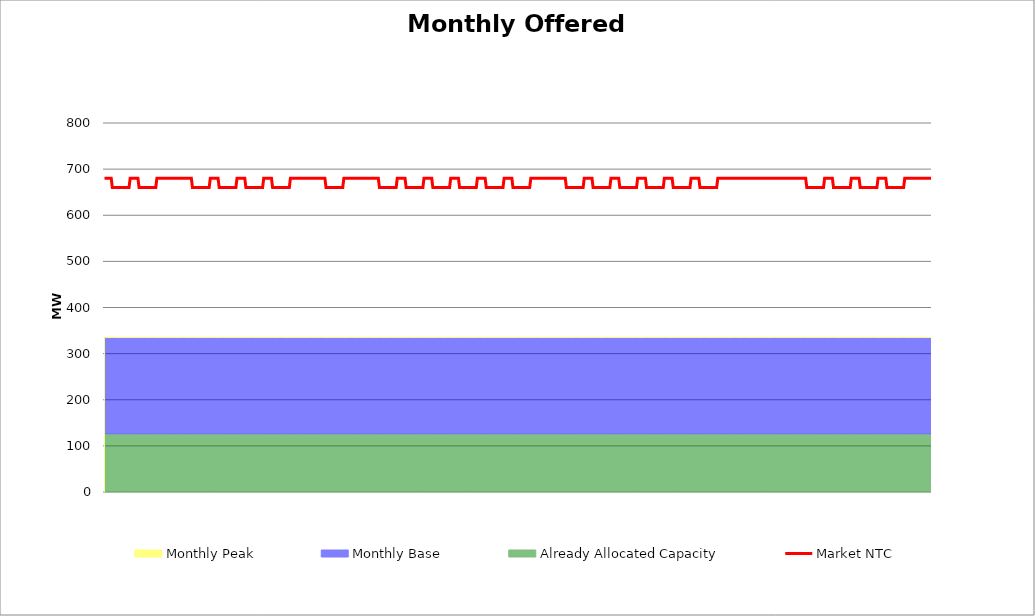
| Category | Market NTC |
|---|---|
| 0 | 680 |
| 1 | 680 |
| 2 | 680 |
| 3 | 680 |
| 4 | 680 |
| 5 | 680 |
| 6 | 680 |
| 7 | 660 |
| 8 | 660 |
| 9 | 660 |
| 10 | 660 |
| 11 | 660 |
| 12 | 660 |
| 13 | 660 |
| 14 | 660 |
| 15 | 660 |
| 16 | 660 |
| 17 | 660 |
| 18 | 660 |
| 19 | 660 |
| 20 | 660 |
| 21 | 660 |
| 22 | 660 |
| 23 | 680 |
| 24 | 680 |
| 25 | 680 |
| 26 | 680 |
| 27 | 680 |
| 28 | 680 |
| 29 | 680 |
| 30 | 680 |
| 31 | 660 |
| 32 | 660 |
| 33 | 660 |
| 34 | 660 |
| 35 | 660 |
| 36 | 660 |
| 37 | 660 |
| 38 | 660 |
| 39 | 660 |
| 40 | 660 |
| 41 | 660 |
| 42 | 660 |
| 43 | 660 |
| 44 | 660 |
| 45 | 660 |
| 46 | 660 |
| 47 | 680 |
| 48 | 680 |
| 49 | 680 |
| 50 | 680 |
| 51 | 680 |
| 52 | 680 |
| 53 | 680 |
| 54 | 680 |
| 55 | 680 |
| 56 | 680 |
| 57 | 680 |
| 58 | 680 |
| 59 | 680 |
| 60 | 680 |
| 61 | 680 |
| 62 | 680 |
| 63 | 680 |
| 64 | 680 |
| 65 | 680 |
| 66 | 680 |
| 67 | 680 |
| 68 | 680 |
| 69 | 680 |
| 70 | 680 |
| 71 | 680 |
| 72 | 680 |
| 73 | 680 |
| 74 | 680 |
| 75 | 680 |
| 76 | 680 |
| 77 | 680 |
| 78 | 680 |
| 79 | 660 |
| 80 | 660 |
| 81 | 660 |
| 82 | 660 |
| 83 | 660 |
| 84 | 660 |
| 85 | 660 |
| 86 | 660 |
| 87 | 660 |
| 88 | 660 |
| 89 | 660 |
| 90 | 660 |
| 91 | 660 |
| 92 | 660 |
| 93 | 660 |
| 94 | 660 |
| 95 | 680 |
| 96 | 680 |
| 97 | 680 |
| 98 | 680 |
| 99 | 680 |
| 100 | 680 |
| 101 | 680 |
| 102 | 680 |
| 103 | 660 |
| 104 | 660 |
| 105 | 660 |
| 106 | 660 |
| 107 | 660 |
| 108 | 660 |
| 109 | 660 |
| 110 | 660 |
| 111 | 660 |
| 112 | 660 |
| 113 | 660 |
| 114 | 660 |
| 115 | 660 |
| 116 | 660 |
| 117 | 660 |
| 118 | 660 |
| 119 | 680 |
| 120 | 680 |
| 121 | 680 |
| 122 | 680 |
| 123 | 680 |
| 124 | 680 |
| 125 | 680 |
| 126 | 680 |
| 127 | 660 |
| 128 | 660 |
| 129 | 660 |
| 130 | 660 |
| 131 | 660 |
| 132 | 660 |
| 133 | 660 |
| 134 | 660 |
| 135 | 660 |
| 136 | 660 |
| 137 | 660 |
| 138 | 660 |
| 139 | 660 |
| 140 | 660 |
| 141 | 660 |
| 142 | 660 |
| 143 | 680 |
| 144 | 680 |
| 145 | 680 |
| 146 | 680 |
| 147 | 680 |
| 148 | 680 |
| 149 | 680 |
| 150 | 680 |
| 151 | 660 |
| 152 | 660 |
| 153 | 660 |
| 154 | 660 |
| 155 | 660 |
| 156 | 660 |
| 157 | 660 |
| 158 | 660 |
| 159 | 660 |
| 160 | 660 |
| 161 | 660 |
| 162 | 660 |
| 163 | 660 |
| 164 | 660 |
| 165 | 660 |
| 166 | 660 |
| 167 | 680 |
| 168 | 680 |
| 169 | 680 |
| 170 | 680 |
| 171 | 680 |
| 172 | 680 |
| 173 | 680 |
| 174 | 680 |
| 175 | 680 |
| 176 | 680 |
| 177 | 680 |
| 178 | 680 |
| 179 | 680 |
| 180 | 680 |
| 181 | 680 |
| 182 | 680 |
| 183 | 680 |
| 184 | 680 |
| 185 | 680 |
| 186 | 680 |
| 187 | 680 |
| 188 | 680 |
| 189 | 680 |
| 190 | 680 |
| 191 | 680 |
| 192 | 680 |
| 193 | 680 |
| 194 | 680 |
| 195 | 680 |
| 196 | 680 |
| 197 | 680 |
| 198 | 680 |
| 199 | 660 |
| 200 | 660 |
| 201 | 660 |
| 202 | 660 |
| 203 | 660 |
| 204 | 660 |
| 205 | 660 |
| 206 | 660 |
| 207 | 660 |
| 208 | 660 |
| 209 | 660 |
| 210 | 660 |
| 211 | 660 |
| 212 | 660 |
| 213 | 660 |
| 214 | 660 |
| 215 | 680 |
| 216 | 680 |
| 217 | 680 |
| 218 | 680 |
| 219 | 680 |
| 220 | 680 |
| 221 | 680 |
| 222 | 680 |
| 223 | 680 |
| 224 | 680 |
| 225 | 680 |
| 226 | 680 |
| 227 | 680 |
| 228 | 680 |
| 229 | 680 |
| 230 | 680 |
| 231 | 680 |
| 232 | 680 |
| 233 | 680 |
| 234 | 680 |
| 235 | 680 |
| 236 | 680 |
| 237 | 680 |
| 238 | 680 |
| 239 | 680 |
| 240 | 680 |
| 241 | 680 |
| 242 | 680 |
| 243 | 680 |
| 244 | 680 |
| 245 | 680 |
| 246 | 680 |
| 247 | 660 |
| 248 | 660 |
| 249 | 660 |
| 250 | 660 |
| 251 | 660 |
| 252 | 660 |
| 253 | 660 |
| 254 | 660 |
| 255 | 660 |
| 256 | 660 |
| 257 | 660 |
| 258 | 660 |
| 259 | 660 |
| 260 | 660 |
| 261 | 660 |
| 262 | 660 |
| 263 | 680 |
| 264 | 680 |
| 265 | 680 |
| 266 | 680 |
| 267 | 680 |
| 268 | 680 |
| 269 | 680 |
| 270 | 680 |
| 271 | 660 |
| 272 | 660 |
| 273 | 660 |
| 274 | 660 |
| 275 | 660 |
| 276 | 660 |
| 277 | 660 |
| 278 | 660 |
| 279 | 660 |
| 280 | 660 |
| 281 | 660 |
| 282 | 660 |
| 283 | 660 |
| 284 | 660 |
| 285 | 660 |
| 286 | 660 |
| 287 | 680 |
| 288 | 680 |
| 289 | 680 |
| 290 | 680 |
| 291 | 680 |
| 292 | 680 |
| 293 | 680 |
| 294 | 680 |
| 295 | 660 |
| 296 | 660 |
| 297 | 660 |
| 298 | 660 |
| 299 | 660 |
| 300 | 660 |
| 301 | 660 |
| 302 | 660 |
| 303 | 660 |
| 304 | 660 |
| 305 | 660 |
| 306 | 660 |
| 307 | 660 |
| 308 | 660 |
| 309 | 660 |
| 310 | 660 |
| 311 | 680 |
| 312 | 680 |
| 313 | 680 |
| 314 | 680 |
| 315 | 680 |
| 316 | 680 |
| 317 | 680 |
| 318 | 680 |
| 319 | 660 |
| 320 | 660 |
| 321 | 660 |
| 322 | 660 |
| 323 | 660 |
| 324 | 660 |
| 325 | 660 |
| 326 | 660 |
| 327 | 660 |
| 328 | 660 |
| 329 | 660 |
| 330 | 660 |
| 331 | 660 |
| 332 | 660 |
| 333 | 660 |
| 334 | 660 |
| 335 | 680 |
| 336 | 680 |
| 337 | 680 |
| 338 | 680 |
| 339 | 680 |
| 340 | 680 |
| 341 | 680 |
| 342 | 680 |
| 343 | 660 |
| 344 | 660 |
| 345 | 660 |
| 346 | 660 |
| 347 | 660 |
| 348 | 660 |
| 349 | 660 |
| 350 | 660 |
| 351 | 660 |
| 352 | 660 |
| 353 | 660 |
| 354 | 660 |
| 355 | 660 |
| 356 | 660 |
| 357 | 660 |
| 358 | 660 |
| 359 | 680 |
| 360 | 680 |
| 361 | 680 |
| 362 | 680 |
| 363 | 680 |
| 364 | 680 |
| 365 | 680 |
| 366 | 680 |
| 367 | 660 |
| 368 | 660 |
| 369 | 660 |
| 370 | 660 |
| 371 | 660 |
| 372 | 660 |
| 373 | 660 |
| 374 | 660 |
| 375 | 660 |
| 376 | 660 |
| 377 | 660 |
| 378 | 660 |
| 379 | 660 |
| 380 | 660 |
| 381 | 660 |
| 382 | 660 |
| 383 | 680 |
| 384 | 680 |
| 385 | 680 |
| 386 | 680 |
| 387 | 680 |
| 388 | 680 |
| 389 | 680 |
| 390 | 680 |
| 391 | 680 |
| 392 | 680 |
| 393 | 680 |
| 394 | 680 |
| 395 | 680 |
| 396 | 680 |
| 397 | 680 |
| 398 | 680 |
| 399 | 680 |
| 400 | 680 |
| 401 | 680 |
| 402 | 680 |
| 403 | 680 |
| 404 | 680 |
| 405 | 680 |
| 406 | 680 |
| 407 | 680 |
| 408 | 680 |
| 409 | 680 |
| 410 | 680 |
| 411 | 680 |
| 412 | 680 |
| 413 | 680 |
| 414 | 680 |
| 415 | 660 |
| 416 | 660 |
| 417 | 660 |
| 418 | 660 |
| 419 | 660 |
| 420 | 660 |
| 421 | 660 |
| 422 | 660 |
| 423 | 660 |
| 424 | 660 |
| 425 | 660 |
| 426 | 660 |
| 427 | 660 |
| 428 | 660 |
| 429 | 660 |
| 430 | 660 |
| 431 | 680 |
| 432 | 680 |
| 433 | 680 |
| 434 | 680 |
| 435 | 680 |
| 436 | 680 |
| 437 | 680 |
| 438 | 680 |
| 439 | 660 |
| 440 | 660 |
| 441 | 660 |
| 442 | 660 |
| 443 | 660 |
| 444 | 660 |
| 445 | 660 |
| 446 | 660 |
| 447 | 660 |
| 448 | 660 |
| 449 | 660 |
| 450 | 660 |
| 451 | 660 |
| 452 | 660 |
| 453 | 660 |
| 454 | 660 |
| 455 | 680 |
| 456 | 680 |
| 457 | 680 |
| 458 | 680 |
| 459 | 680 |
| 460 | 680 |
| 461 | 680 |
| 462 | 680 |
| 463 | 660 |
| 464 | 660 |
| 465 | 660 |
| 466 | 660 |
| 467 | 660 |
| 468 | 660 |
| 469 | 660 |
| 470 | 660 |
| 471 | 660 |
| 472 | 660 |
| 473 | 660 |
| 474 | 660 |
| 475 | 660 |
| 476 | 660 |
| 477 | 660 |
| 478 | 660 |
| 479 | 680 |
| 480 | 680 |
| 481 | 680 |
| 482 | 680 |
| 483 | 680 |
| 484 | 680 |
| 485 | 680 |
| 486 | 680 |
| 487 | 660 |
| 488 | 660 |
| 489 | 660 |
| 490 | 660 |
| 491 | 660 |
| 492 | 660 |
| 493 | 660 |
| 494 | 660 |
| 495 | 660 |
| 496 | 660 |
| 497 | 660 |
| 498 | 660 |
| 499 | 660 |
| 500 | 660 |
| 501 | 660 |
| 502 | 660 |
| 503 | 680 |
| 504 | 680 |
| 505 | 680 |
| 506 | 680 |
| 507 | 680 |
| 508 | 680 |
| 509 | 680 |
| 510 | 680 |
| 511 | 660 |
| 512 | 660 |
| 513 | 660 |
| 514 | 660 |
| 515 | 660 |
| 516 | 660 |
| 517 | 660 |
| 518 | 660 |
| 519 | 660 |
| 520 | 660 |
| 521 | 660 |
| 522 | 660 |
| 523 | 660 |
| 524 | 660 |
| 525 | 660 |
| 526 | 660 |
| 527 | 680 |
| 528 | 680 |
| 529 | 680 |
| 530 | 680 |
| 531 | 680 |
| 532 | 680 |
| 533 | 680 |
| 534 | 680 |
| 535 | 660 |
| 536 | 660 |
| 537 | 660 |
| 538 | 660 |
| 539 | 660 |
| 540 | 660 |
| 541 | 660 |
| 542 | 660 |
| 543 | 660 |
| 544 | 660 |
| 545 | 660 |
| 546 | 660 |
| 547 | 660 |
| 548 | 660 |
| 549 | 660 |
| 550 | 660 |
| 551 | 680 |
| 552 | 680 |
| 553 | 680 |
| 554 | 680 |
| 555 | 680 |
| 556 | 680 |
| 557 | 680 |
| 558 | 680 |
| 559 | 680 |
| 560 | 680 |
| 561 | 680 |
| 562 | 680 |
| 563 | 680 |
| 564 | 680 |
| 565 | 680 |
| 566 | 680 |
| 567 | 680 |
| 568 | 680 |
| 569 | 680 |
| 570 | 680 |
| 571 | 680 |
| 572 | 680 |
| 573 | 680 |
| 574 | 680 |
| 575 | 680 |
| 576 | 680 |
| 577 | 680 |
| 578 | 680 |
| 579 | 680 |
| 580 | 680 |
| 581 | 680 |
| 582 | 680 |
| 583 | 680 |
| 584 | 680 |
| 585 | 680 |
| 586 | 680 |
| 587 | 680 |
| 588 | 680 |
| 589 | 680 |
| 590 | 680 |
| 591 | 680 |
| 592 | 680 |
| 593 | 680 |
| 594 | 680 |
| 595 | 680 |
| 596 | 680 |
| 597 | 680 |
| 598 | 680 |
| 599 | 680 |
| 600 | 680 |
| 601 | 680 |
| 602 | 680 |
| 603 | 680 |
| 604 | 680 |
| 605 | 680 |
| 606 | 680 |
| 607 | 680 |
| 608 | 680 |
| 609 | 680 |
| 610 | 680 |
| 611 | 680 |
| 612 | 680 |
| 613 | 680 |
| 614 | 680 |
| 615 | 680 |
| 616 | 680 |
| 617 | 680 |
| 618 | 680 |
| 619 | 680 |
| 620 | 680 |
| 621 | 680 |
| 622 | 680 |
| 623 | 680 |
| 624 | 680 |
| 625 | 680 |
| 626 | 680 |
| 627 | 680 |
| 628 | 680 |
| 629 | 680 |
| 630 | 680 |
| 631 | 660 |
| 632 | 660 |
| 633 | 660 |
| 634 | 660 |
| 635 | 660 |
| 636 | 660 |
| 637 | 660 |
| 638 | 660 |
| 639 | 660 |
| 640 | 660 |
| 641 | 660 |
| 642 | 660 |
| 643 | 660 |
| 644 | 660 |
| 645 | 660 |
| 646 | 660 |
| 647 | 680 |
| 648 | 680 |
| 649 | 680 |
| 650 | 680 |
| 651 | 680 |
| 652 | 680 |
| 653 | 680 |
| 654 | 680 |
| 655 | 660 |
| 656 | 660 |
| 657 | 660 |
| 658 | 660 |
| 659 | 660 |
| 660 | 660 |
| 661 | 660 |
| 662 | 660 |
| 663 | 660 |
| 664 | 660 |
| 665 | 660 |
| 666 | 660 |
| 667 | 660 |
| 668 | 660 |
| 669 | 660 |
| 670 | 660 |
| 671 | 680 |
| 672 | 680 |
| 673 | 680 |
| 674 | 680 |
| 675 | 680 |
| 676 | 680 |
| 677 | 680 |
| 678 | 680 |
| 679 | 660 |
| 680 | 660 |
| 681 | 660 |
| 682 | 660 |
| 683 | 660 |
| 684 | 660 |
| 685 | 660 |
| 686 | 660 |
| 687 | 660 |
| 688 | 660 |
| 689 | 660 |
| 690 | 660 |
| 691 | 660 |
| 692 | 660 |
| 693 | 660 |
| 694 | 660 |
| 695 | 680 |
| 696 | 680 |
| 697 | 680 |
| 698 | 680 |
| 699 | 680 |
| 700 | 680 |
| 701 | 680 |
| 702 | 680 |
| 703 | 660 |
| 704 | 660 |
| 705 | 660 |
| 706 | 660 |
| 707 | 660 |
| 708 | 660 |
| 709 | 660 |
| 710 | 660 |
| 711 | 660 |
| 712 | 660 |
| 713 | 660 |
| 714 | 660 |
| 715 | 660 |
| 716 | 660 |
| 717 | 660 |
| 718 | 660 |
| 719 | 680 |
| 720 | 680 |
| 721 | 680 |
| 722 | 680 |
| 723 | 680 |
| 724 | 680 |
| 725 | 680 |
| 726 | 680 |
| 727 | 680 |
| 728 | 680 |
| 729 | 680 |
| 730 | 680 |
| 731 | 680 |
| 732 | 680 |
| 733 | 680 |
| 734 | 680 |
| 735 | 680 |
| 736 | 680 |
| 737 | 680 |
| 738 | 680 |
| 739 | 680 |
| 740 | 680 |
| 741 | 680 |
| 742 | 680 |
| 743 | 680 |